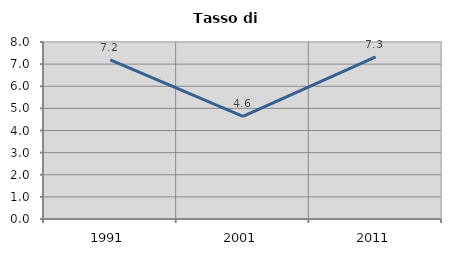
| Category | Tasso di disoccupazione   |
|---|---|
| 1991.0 | 7.189 |
| 2001.0 | 4.635 |
| 2011.0 | 7.33 |